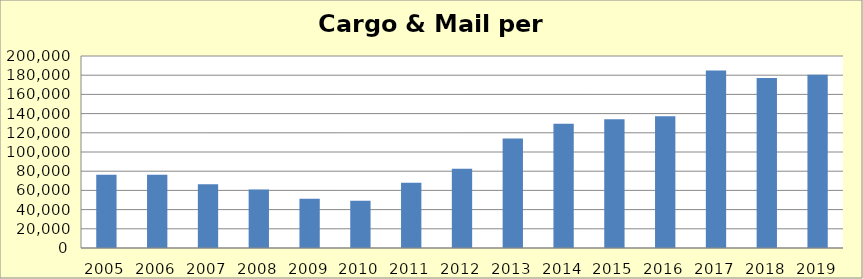
| Category | Series 0 |
|---|---|
| 2005.0 | 76315.983 |
| 2006.0 | 76405.004 |
| 2007.0 | 66436.915 |
| 2008.0 | 60874.844 |
| 2009.0 | 51204.729 |
| 2010.0 | 49337.216 |
| 2011.0 | 68018.328 |
| 2012.0 | 82432.496 |
| 2013.0 | 113941.676 |
| 2014.0 | 129508.999 |
| 2015.0 | 134238.079 |
| 2016.0 | 137179.666 |
| 2017.0 | 184973.555 |
| 2018.0 | 176995.583 |
| 2019.0 | 180577.928 |